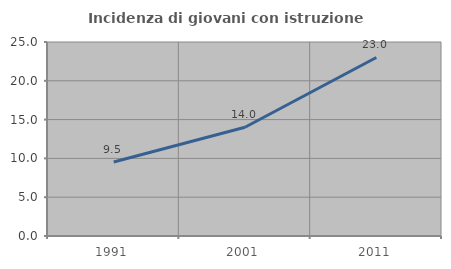
| Category | Incidenza di giovani con istruzione universitaria |
|---|---|
| 1991.0 | 9.543 |
| 2001.0 | 14.015 |
| 2011.0 | 23.004 |